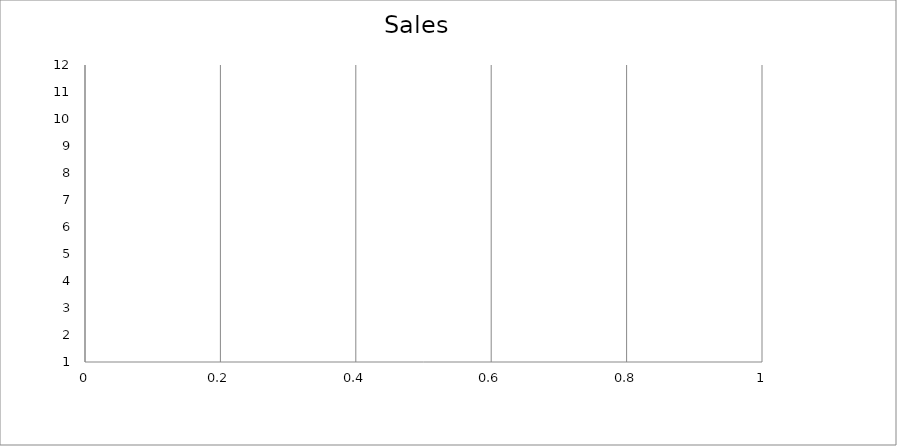
| Category | Actual |
|---|---|
| 0 | 3310 |
| 1 | 2910 |
| 2 | 1330 |
| 3 | 1590 |
| 4 | 820 |
| 5 | 660 |
| 6 | 2750 |
| 7 | 890 |
| 8 | 3440 |
| 9 | 1560 |
| 10 | 2350 |
| 11 | 1880 |